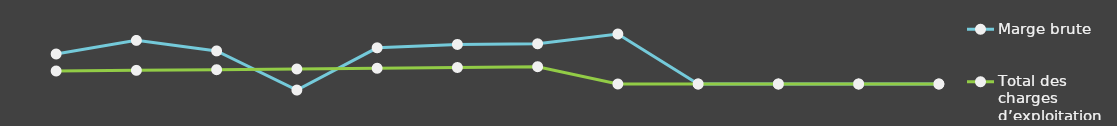
| Category | Marge brute | Total des charges d’exploitation |
|---|---|---|
| 0 | 25000 | 10841 |
| 1 | 36348 | 11367.25 |
| 2 | 27562 | 11919.82 |
| 3 | -5059.5 | 12500.01 |
| 4 | 30153.18 | 13109.21 |
| 5 | 32964.45 | 13748.86 |
| 6 | 33502.87 | 14420.51 |
| 7 | 41646 | 0 |
| 8 | 0 | 0 |
| 9 | 0 | 0 |
| 10 | 0 | 0 |
| 11 | 0 | 0 |